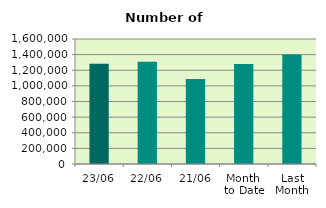
| Category | Series 0 |
|---|---|
| 23/06 | 1284312 |
| 22/06 | 1309848 |
| 21/06 | 1086516 |
| Month 
to Date | 1280695.176 |
| Last
Month | 1401172.455 |